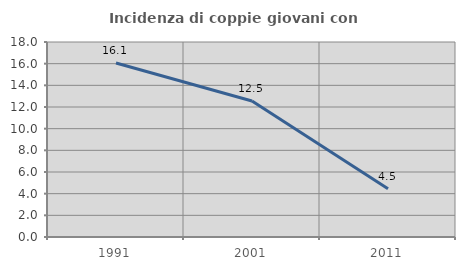
| Category | Incidenza di coppie giovani con figli |
|---|---|
| 1991.0 | 16.064 |
| 2001.0 | 12.548 |
| 2011.0 | 4.452 |